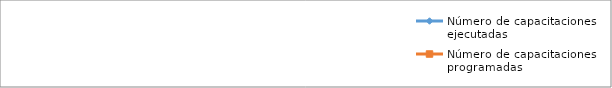
| Category | Número de capacitaciones ejecutadas | Número de capacitaciones programadas |
|---|---|---|
| Enero  | 0 | 0 |
| Febrero | 0 | 0 |
| Marzo | 1 | 1 |
| Abril | 1 | 1 |
| Mayo | 1 | 1 |
| Junio | 1 | 1 |
| Julio | 1 | 1 |
| Agosto | 1 | 1 |
| Septiembre | 2 | 2 |
| Octubre | 2 | 2 |
| Noviembre | 2 | 2 |
| Diciembre | 2 | 2 |